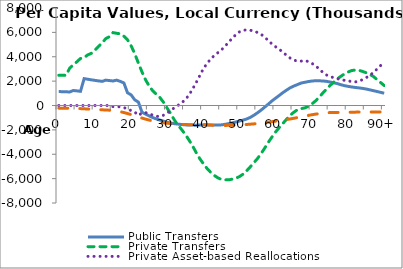
| Category | Public Transfers | Private Transfers | Private Asset-based Reallocations | Public Asset-based Reallocations |
|---|---|---|---|---|
| 0 | 1143763.287 | 2479371.096 | 0 | -219005.292 |
|  | 1133837.305 | 2476924.844 | 0 | -220280.201 |
| 2 | 1123911.323 | 2473630.571 | 0 | -221555.111 |
| 3 | 1110775.989 | 3059998.738 | 0 | -224937.852 |
| 4 | 1229917.965 | 3347573.43 | 0 | -231619.74 |
| 5 | 1199693.23 | 3581527.793 | 0 | -242184.098 |
| 6 | 1161552.021 | 3860391.77 | 0 | -255596.86 |
| 7 | 2203871.225 | 3932846.867 | 0 | -271498.882 |
| 8 | 2154610.67 | 4151466.657 | 0 | -288284.324 |
| 9 | 2106232.949 | 4279761.916 | 0 | -305031.296 |
| 10 | 2060887.529 | 4538148.607 | 0 | -321590.948 |
| 11 | 2019294.587 | 4857187.572 | 0 | -337782.132 |
| 12 | 1980488.399 | 5139541.848 | 0 | -353234.087 |
| 13 | 2080572.75 | 5490617.365 | 0 | -368548.798 |
| 14 | 2044727.815 | 5643492.881 | 0 | -383566.942 |
| 15 | 2012329.286 | 5980898.899 | -90722.41 | -398596.479 |
| 16 | 2081276.879 | 5923813.674 | -89699.626 | -458215.611 |
| 17 | 1979069.903 | 5882123.045 | -109316.797 | -510165.046 |
| 18 | 1848827.046 | 5683770.495 | -177617.739 | -576970.145 |
| 19 | 1044739.282 | 5388199.628 | -260667.377 | -657947.057 |
| 20 | 870743.701 | 4899720.79 | -427144.555 | -748643.352 |
| 21 | 465607.378 | 4252680.538 | -534447.429 | -842012.846 |
| 22 | 281113.612 | 3489394.253 | -809806.071 | -937034.703 |
| 23 | -544533.394 | 2760971.94 | -623874.288 | -1030289.018 |
| 24 | -710545.307 | 2105391.424 | -583899.41 | -1117247.883 |
| 25 | -857512.913 | 1596554.108 | -672171.272 | -1196389.437 |
| 26 | -992156.058 | 1194676.06 | -797295.031 | -1267431.129 |
| 27 | -1105936.225 | 922584.357 | -889108.387 | -1327480.204 |
| 28 | -1200620.021 | 640164.879 | -888769.054 | -1376653.747 |
| 29 | -1282176.592 | 248321.805 | -792103.943 | -1418890.294 |
| 30 | -1386905.277 | -236109.49 | -603602.819 | -1454162.696 |
| 31 | -1440867.126 | -689945.969 | -415330.77 | -1481315.47 |
| 32 | -1492535.899 | -1208781.036 | -173324.996 | -1508210.074 |
| 33 | -1528830.167 | -1622837.58 | 15039.818 | -1526962.152 |
| 34 | -1561730.943 | -1987169.552 | 221153.65 | -1544739.984 |
| 35 | -1588871.939 | -2373609.718 | 490542.656 | -1560138.295 |
| 36 | -1609667.516 | -2830424.468 | 855632.127 | -1572467.679 |
| 37 | -1608767.896 | -3312168.883 | 1350577.621 | -1575756.38 |
| 38 | -1612494.13 | -3864182.375 | 1882768.452 | -1582785.004 |
| 39 | -1600344.44 | -4366008.475 | 2452611.3 | -1583034.663 |
| 40 | -1589927.521 | -4783709.02 | 3023608.119 | -1584568.503 |
| 41 | -1586785.191 | -5166869.808 | 3454295.774 | -1592613.473 |
| 42 | -1595512.83 | -5482072.041 | 3802941.014 | -1606781.028 |
| 43 | -1603078.599 | -5737230.557 | 4099473.54 | -1621027.659 |
| 44 | -1603836.987 | -5934920.674 | 4333135.293 | -1636256.712 |
| 45 | -1588239.875 | -6074641.791 | 4567928.399 | -1643090.361 |
| 46 | -1543608.93 | -6101587.128 | 4871790.125 | -1636415.232 |
| 47 | -1487634.195 | -6098502.423 | 5200712.603 | -1624903.149 |
| 48 | -1424437.417 | -6044859.864 | 5526951.138 | -1613264.475 |
| 49 | -1349586.887 | -5967866.81 | 5821976.708 | -1596706.601 |
| 50 | -1273579.482 | -5824277.983 | 6049037.468 | -1581540.827 |
| 51 | -1197519.024 | -5625900.932 | 6178132.171 | -1570030.248 |
| 52 | -1101450.535 | -5344617.09 | 6198971.731 | -1555087.568 |
| 53 | -970812.099 | -5022383.55 | 6173832.166 | -1531928.282 |
| 54 | -794192.096 | -4680901.185 | 6098124.423 | -1506374.53 |
| 55 | -589418.071 | -4334277.555 | 5988884.592 | -1475539.914 |
| 56 | -367137.445 | -3929597.198 | 5829562.942 | -1438085.192 |
| 57 | -121302.498 | -3471901.182 | 5598585.405 | -1400803.87 |
| 58 | 127683.308 | -2997518.637 | 5304720.834 | -1364638.613 |
| 59 | 384822.421 | -2569366.62 | 5040250.002 | -1324387.582 |
| 60 | 607745.684 | -2154635.122 | 4812228.19 | -1283697.126 |
| 61 | 832262.338 | -1802384.47 | 4612621.918 | -1246396.841 |
| 62 | 1060111.814 | -1464158.772 | 4364120.877 | -1204312.9 |
| 63 | 1262746.44 | -1128570.815 | 4117875.591 | -1153526.901 |
| 64 | 1454181.377 | -801705.792 | 3887489.892 | -1103154.204 |
| 65 | 1596526.046 | -555292.238 | 3737732.842 | -1051369.98 |
| 66 | 1714574.167 | -351620.505 | 3626877.272 | -989925.125 |
| 67 | 1839460.138 | -256563.576 | 3639825.226 | -927977.684 |
| 68 | 1901769.338 | -201105.272 | 3690965.959 | -874085.042 |
| 69 | 1963646.167 | -76736.95 | 3609404.08 | -813953.35 |
| 70 | 2006831.154 | 128098.721 | 3457374.633 | -757411.426 |
| 71 | 2031892.261 | 373392.651 | 3258052.945 | -709970.262 |
| 72 | 2025453.055 | 673317.987 | 3003531.259 | -668138.945 |
| 73 | 2013831.218 | 1018707.838 | 2726449.66 | -626626.204 |
| 74 | 1983460.61 | 1325489.783 | 2510703.757 | -601671.92 |
| 75 | 1929241.704 | 1634177.725 | 2372056.048 | -579642.3 |
| 76 | 1863716.678 | 1904801.075 | 2290746.519 | -571908.087 |
| 77 | 1800470.111 | 2170477.451 | 2196141.042 | -567383.47 |
| 78 | 1706431.185 | 2391526.078 | 2143828.946 | -568627.89 |
| 79 | 1629701.932 | 2594238.442 | 2068831.265 | -565811.732 |
| 80 | 1570987.951 | 2746458.102 | 2042581.198 | -558150.315 |
| 81 | 1520118.839 | 2867682.14 | 1946602.497 | -551740.539 |
| 82 | 1480371.764 | 2914363.356 | 1933327.141 | -544838.096 |
| 83 | 1444675.39 | 2890504.754 | 1988023.604 | -538679.394 |
| 84 | 1403160.844 | 2797278.693 | 2121000.904 | -534775.125 |
| 85 | 1353047.774 | 2690877.208 | 2280301.945 | -532774.633 |
| 86 | 1288138.493 | 2552801.024 | 2473726.93 | -530533.452 |
| 87 | 1218213.372 | 2383396.635 | 2693622.83 | -529731.466 |
| 88 | 1150335.697 | 2134848.68 | 2981389.734 | -529393.286 |
| 89 | 1079073.225 | 1886511.037 | 3271843.353 | -529538.926 |
| 90+ | 1007667.676 | 1638176.582 | 3561698.711 | -529754.053 |